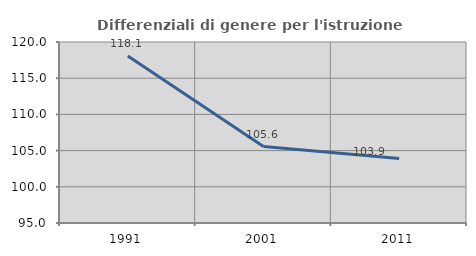
| Category | Differenziali di genere per l'istruzione superiore |
|---|---|
| 1991.0 | 118.068 |
| 2001.0 | 105.55 |
| 2011.0 | 103.908 |